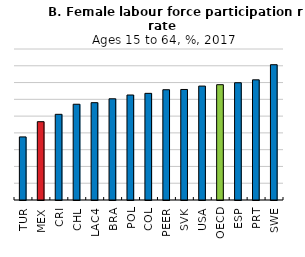
| Category | Series 0 |
|---|---|
| TUR | 37.595 |
| MEX | 46.673 |
| CRI | 51.068 |
| CHL | 57.076 |
| LAC4 | 58.009 |
| BRA | 60.327 |
| POL | 62.579 |
| COL | 63.564 |
| PEER | 65.722 |
| SVK | 65.879 |
| USA | 67.894 |
| OECD | 68.729 |
| ESP | 69.898 |
| PRT | 71.626 |
| SWE | 80.633 |